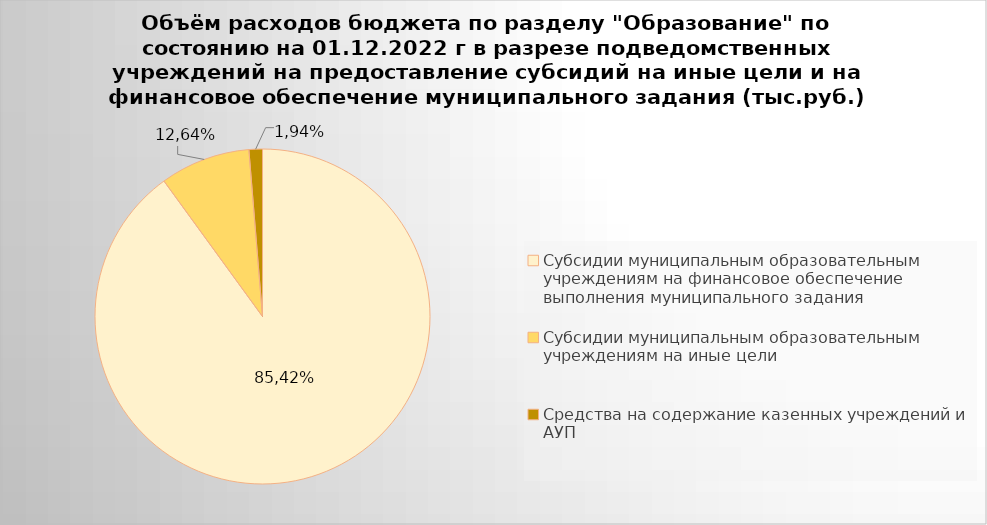
| Category | Series 0 |
|---|---|
| Субсидии муниципальным образовательным учреждениям на финансовое обеспечение выполнения муниципального задания | 7104808.85 |
| Субсидии муниципальным образовательным учреждениям на иные цели | 687776.92 |
| Средства на содержание казенных учреждений и АУП | 102487.09 |